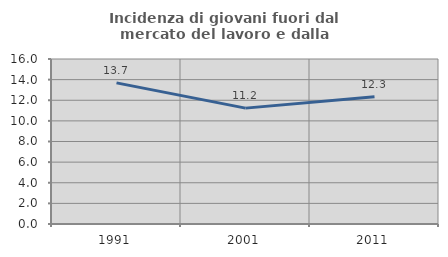
| Category | Incidenza di giovani fuori dal mercato del lavoro e dalla formazione  |
|---|---|
| 1991.0 | 13.684 |
| 2001.0 | 11.236 |
| 2011.0 | 12.346 |